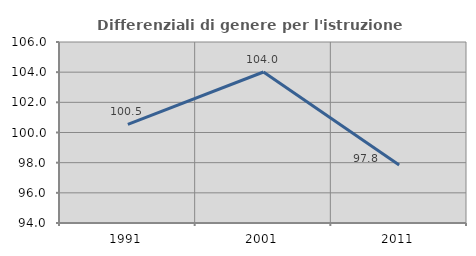
| Category | Differenziali di genere per l'istruzione superiore |
|---|---|
| 1991.0 | 100.54 |
| 2001.0 | 104.01 |
| 2011.0 | 97.841 |